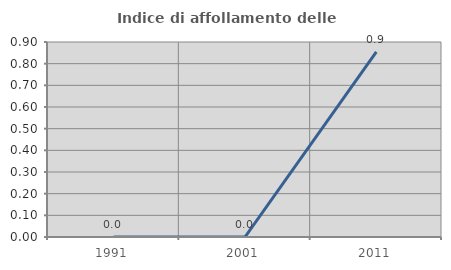
| Category | Indice di affollamento delle abitazioni  |
|---|---|
| 1991.0 | 0 |
| 2001.0 | 0 |
| 2011.0 | 0.855 |